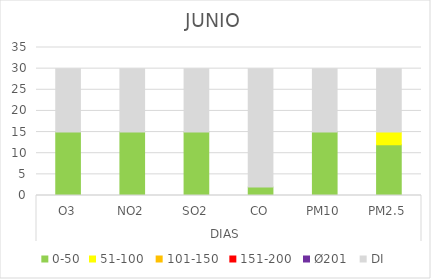
| Category | 0-50 | 51-100  | 101-150  | 151-200  | Ø201  | DI |
|---|---|---|---|---|---|---|
| 0 | 15 | 0 | 0 | 0 | 0 | 15 |
| 1 | 15 | 0 | 0 | 0 | 0 | 15 |
| 2 | 15 | 0 | 0 | 0 | 0 | 15 |
| 3 | 2 | 0 | 0 | 0 | 0 | 28 |
| 4 | 15 | 0 | 0 | 0 | 0 | 15 |
| 5 | 12 | 3 | 0 | 0 | 0 | 15 |